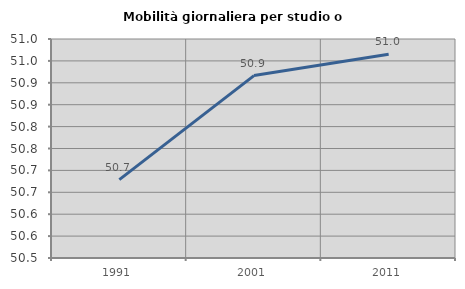
| Category | Mobilità giornaliera per studio o lavoro |
|---|---|
| 1991.0 | 50.679 |
| 2001.0 | 50.916 |
| 2011.0 | 50.965 |